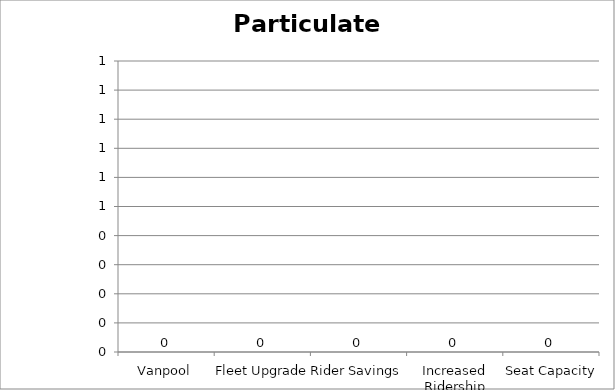
| Category | Particulate Matter |
|---|---|
| Vanpool | 0 |
| Fleet Upgrade | 0 |
| Rider Savings | 0 |
| Increased Ridership | 0 |
| Seat Capacity | 0 |